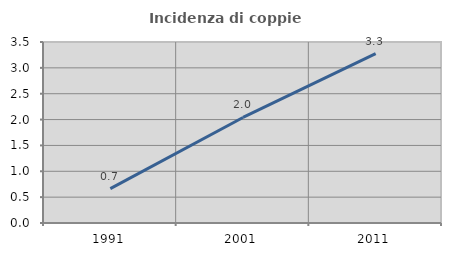
| Category | Incidenza di coppie miste |
|---|---|
| 1991.0 | 0.665 |
| 2001.0 | 2.041 |
| 2011.0 | 3.275 |